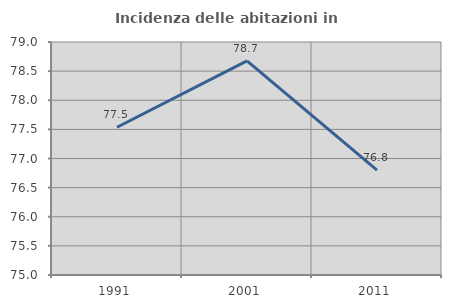
| Category | Incidenza delle abitazioni in proprietà  |
|---|---|
| 1991.0 | 77.536 |
| 2001.0 | 78.676 |
| 2011.0 | 76.8 |